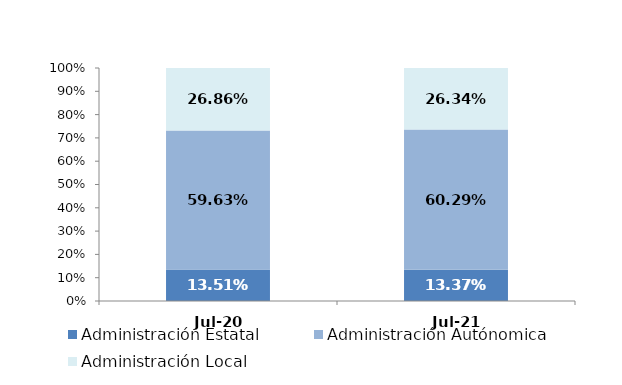
| Category | Administración Estatal | Administración Autónomica | Administración Local |
|---|---|---|---|
| 2020-07-01 | 0.135 | 0.596 | 0.269 |
| 2021-07-01 | 0.134 | 0.603 | 0.263 |